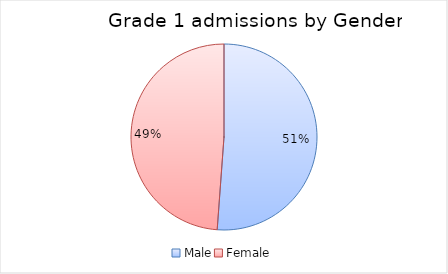
| Category | Series 0 |
|---|---|
| Male | 167794 |
| Female | 160131 |